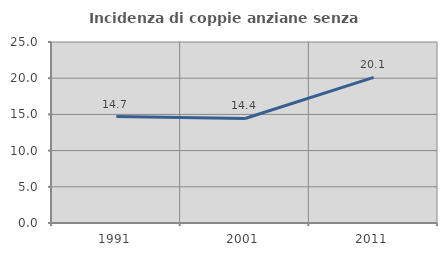
| Category | Incidenza di coppie anziane senza figli  |
|---|---|
| 1991.0 | 14.695 |
| 2001.0 | 14.434 |
| 2011.0 | 20.114 |